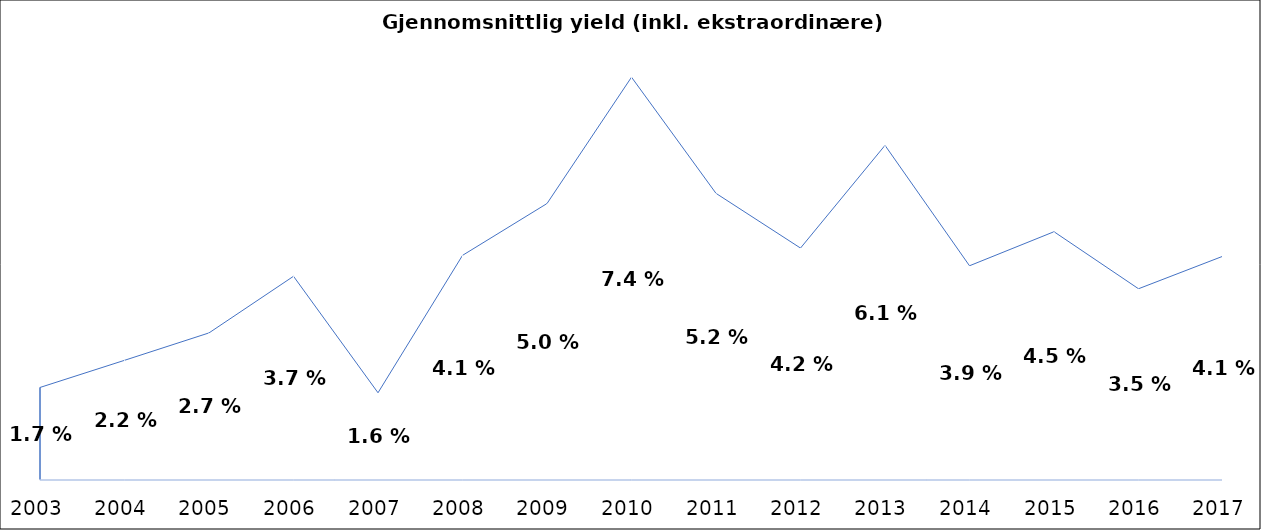
| Category | Gjennomsnitt |
|---|---|
| 2003.0 | 0.017 |
| 2004.0 | 0.022 |
| 2005.0 | 0.027 |
| 2006.0 | 0.037 |
| 2007.0 | 0.016 |
| 2008.0 | 0.041 |
| 2009.0 | 0.05 |
| 2010.0 | 0.074 |
| 2011.0 | 0.052 |
| 2012.0 | 0.042 |
| 2013.0 | 0.061 |
| 2014.0 | 0.039 |
| 2015.0 | 0.045 |
| 2016.0 | 0.035 |
| 2017.0 | 0.041 |